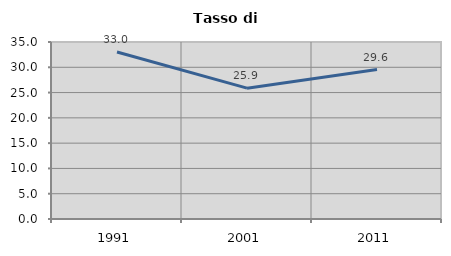
| Category | Tasso di disoccupazione   |
|---|---|
| 1991.0 | 33.019 |
| 2001.0 | 25.872 |
| 2011.0 | 29.554 |